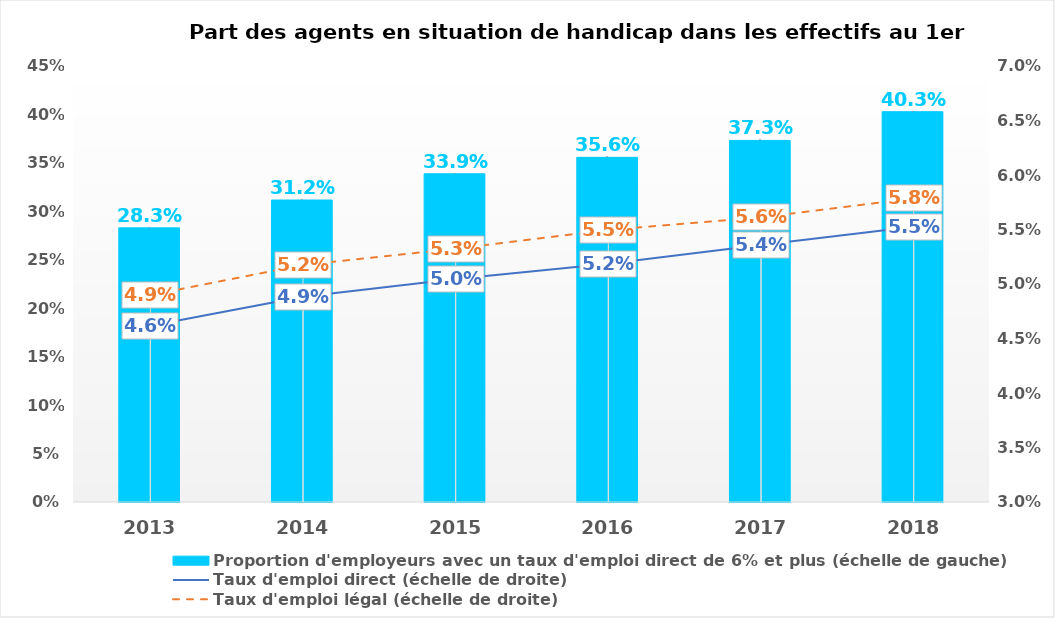
| Category | Proportion d'employeurs avec un taux d'emploi direct de 6% et plus (échelle de gauche) |
|---|---|
| 2013.0 | 0.283 |
| 2014.0 | 0.312 |
| 2015.0 | 0.339 |
| 2016.0 | 0.356 |
| 2017.0 | 0.373 |
| 2018.0 | 0.403 |